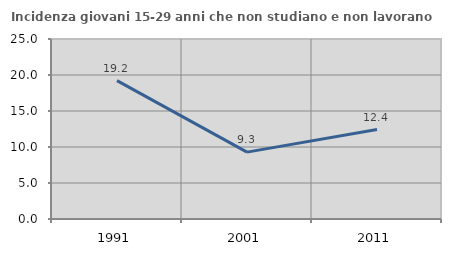
| Category | Incidenza giovani 15-29 anni che non studiano e non lavorano  |
|---|---|
| 1991.0 | 19.221 |
| 2001.0 | 9.291 |
| 2011.0 | 12.427 |